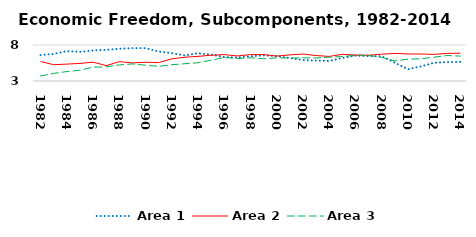
| Category | Area 1 | Area 2 | Area 3 |
|---|---|---|---|
| 1982.0 | 6.611 | 5.704 | 3.695 |
| 1983.0 | 6.757 | 5.263 | 4.06 |
| 1984.0 | 7.152 | 5.345 | 4.31 |
| 1985.0 | 7.045 | 5.445 | 4.501 |
| 1986.0 | 7.246 | 5.616 | 4.921 |
| 1987.0 | 7.329 | 5.136 | 4.96 |
| 1988.0 | 7.478 | 5.686 | 5.236 |
| 1989.0 | 7.566 | 5.517 | 5.369 |
| 1990.0 | 7.566 | 5.604 | 5.2 |
| 1991.0 | 7.104 | 5.557 | 5.037 |
| 1992.0 | 6.869 | 6.078 | 5.26 |
| 1993.0 | 6.548 | 6.305 | 5.4 |
| 1994.0 | 6.855 | 6.421 | 5.535 |
| 1995.0 | 6.661 | 6.58 | 5.891 |
| 1996.0 | 6.326 | 6.663 | 6.278 |
| 1997.0 | 6.26 | 6.481 | 6.121 |
| 1998.0 | 6.436 | 6.671 | 6.225 |
| 1999.0 | 6.557 | 6.668 | 6.091 |
| 2000.0 | 6.474 | 6.458 | 6.221 |
| 2001.0 | 6.187 | 6.629 | 6.186 |
| 2002.0 | 5.9 | 6.743 | 6.216 |
| 2003.0 | 5.844 | 6.533 | 6.2 |
| 2004.0 | 5.788 | 6.414 | 6.312 |
| 2005.0 | 6.188 | 6.703 | 6.389 |
| 2006.0 | 6.519 | 6.606 | 6.579 |
| 2007.0 | 6.454 | 6.582 | 6.556 |
| 2008.0 | 6.439 | 6.725 | 6.275 |
| 2009.0 | 5.542 | 6.836 | 5.79 |
| 2010.0 | 4.633 | 6.753 | 6.036 |
| 2011.0 | 5.034 | 6.746 | 6.074 |
| 2012.0 | 5.534 | 6.695 | 6.311 |
| 2013.0 | 5.619 | 6.837 | 6.54 |
| 2014.0 | 5.656 | 6.856 | 6.458 |